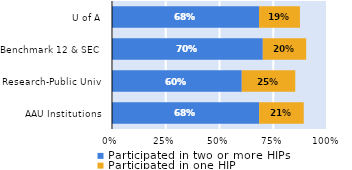
| Category | Participated in two or more HIPs | Participated in one HIP |
|---|---|---|
| AAU Institutions | 0.684 | 0.208 |
| Research-Public Univ | 0.604 | 0.249 |
| Benchmark 12 & SEC | 0.701 | 0.202 |
| U of A | 0.684 | 0.19 |